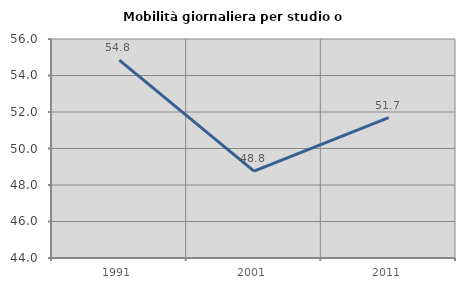
| Category | Mobilità giornaliera per studio o lavoro |
|---|---|
| 1991.0 | 54.839 |
| 2001.0 | 48.756 |
| 2011.0 | 51.688 |